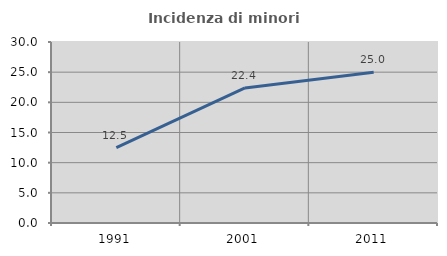
| Category | Incidenza di minori stranieri |
|---|---|
| 1991.0 | 12.5 |
| 2001.0 | 22.388 |
| 2011.0 | 25 |